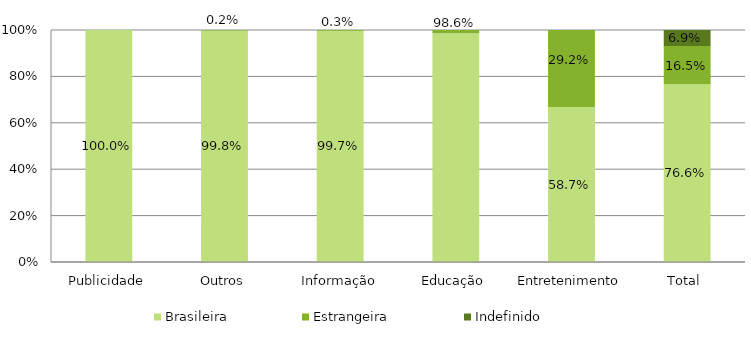
| Category | Brasileira | Estrangeira | Indefinido |
|---|---|---|---|
| Publicidade | 1 | 0 | 0 |
| Outros | 0.998 | 0.002 | 0 |
| Informação | 0.997 | 0.003 | 0 |
| Educação | 0.986 | 0.014 | 0 |
| Entretenimento | 0.587 | 0.292 | 0 |
| Total  | 0.766 | 0.165 | 0.069 |